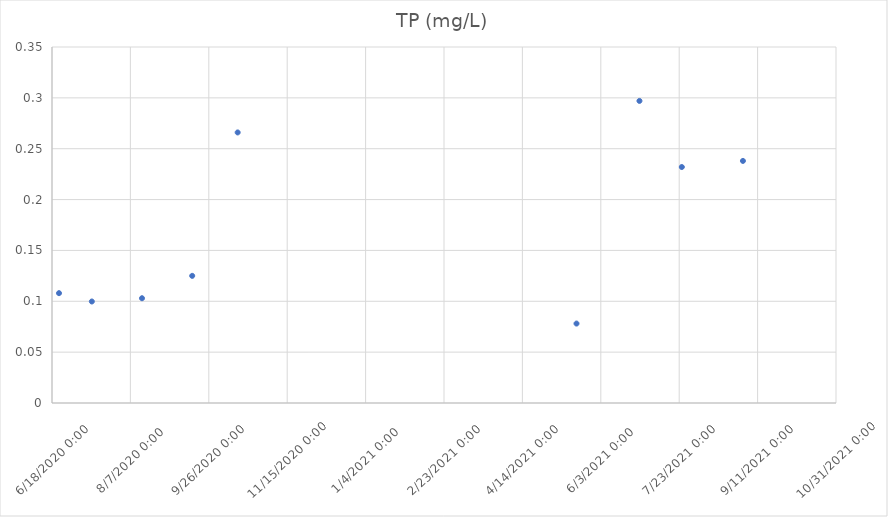
| Category | TP (mg/L) |
|---|---|
| 44004.46666666667 | 0.108 |
| 44025.40277777778 | 0.1 |
| 44057.39722222222 | 0.103 |
| 44089.407638888886 | 0.125 |
| 44118.41527777778 | 0.266 |
| 44334.504166666666 | 0.078 |
| 44374.65277777778 | 0.297 |
| 44401.666666666664 | 0.232 |
| 44440.645833333336 | 0.238 |